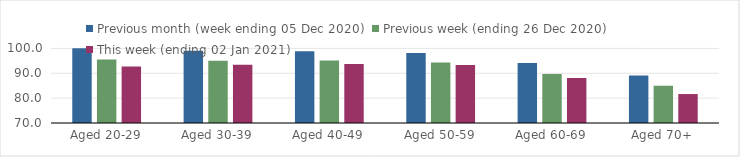
| Category | Previous month (week ending 05 Dec 2020) | Previous week (ending 26 Dec 2020) | This week (ending 02 Jan 2021) |
|---|---|---|---|
| Aged 20-29 | 100.09 | 95.51 | 92.72 |
| Aged 30-39 | 99.04 | 95.08 | 93.4 |
| Aged 40-49 | 98.84 | 95.13 | 93.78 |
| Aged 50-59 | 98.17 | 94.34 | 93.34 |
| Aged 60-69 | 94.18 | 89.73 | 88.07 |
| Aged 70+ | 89.12 | 84.99 | 81.65 |